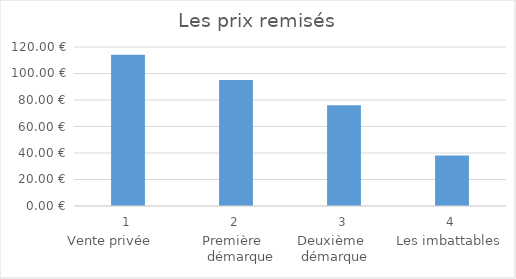
| Category | Series 0 |
|---|---|
| 0 | 114.075 |
| 1 | 95.063 |
| 2 | 76.05 |
| 3 | 38.025 |